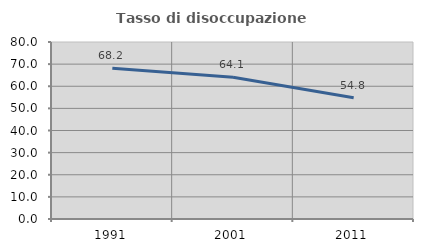
| Category | Tasso di disoccupazione giovanile  |
|---|---|
| 1991.0 | 68.182 |
| 2001.0 | 64.103 |
| 2011.0 | 54.839 |